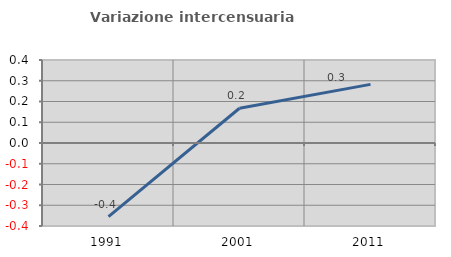
| Category | Variazione intercensuaria annua |
|---|---|
| 1991.0 | -0.355 |
| 2001.0 | 0.168 |
| 2011.0 | 0.283 |